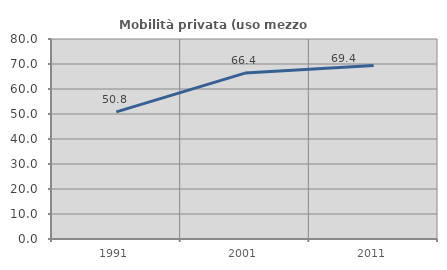
| Category | Mobilità privata (uso mezzo privato) |
|---|---|
| 1991.0 | 50.837 |
| 2001.0 | 66.363 |
| 2011.0 | 69.439 |